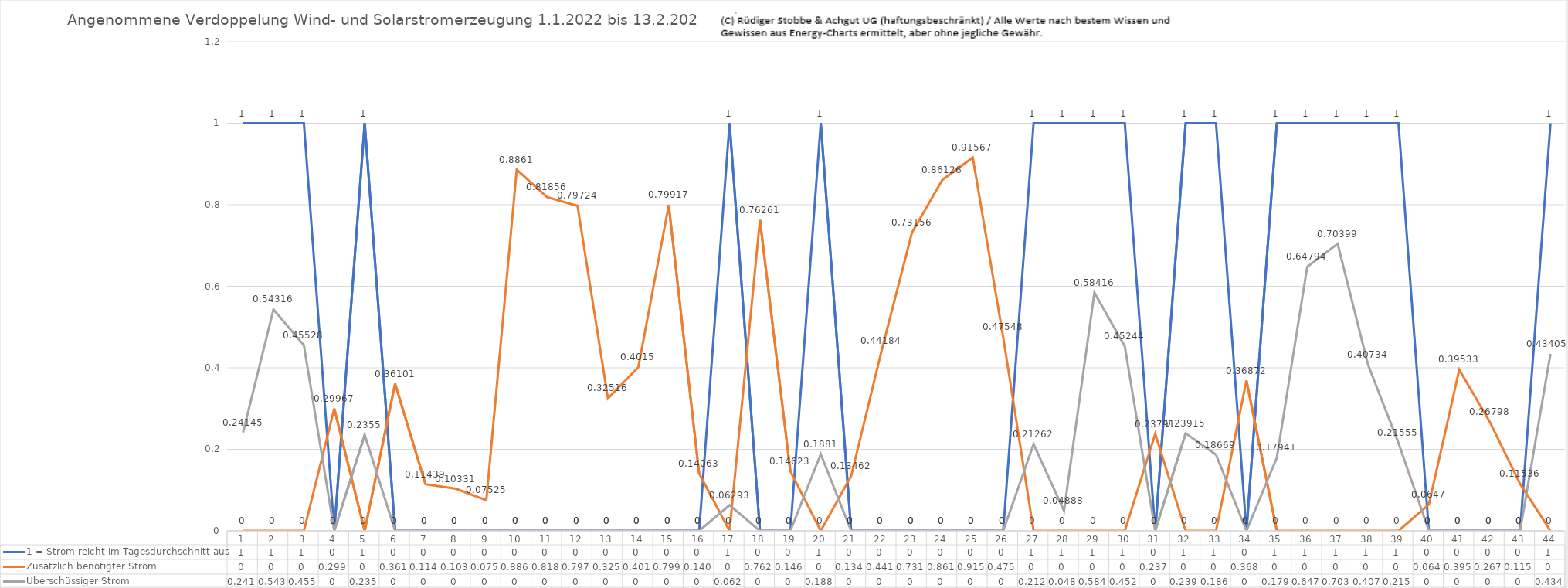
| Category | 1 = Strom reicht im Tagesdurchschnitt aus | Zusätzlich benötigter Strom | Überschüssiger Strom |
|---|---|---|---|
| 0 | 1 | 0 | 0.241 |
| 1 | 1 | 0 | 0.543 |
| 2 | 1 | 0 | 0.455 |
| 3 | 0 | 0.3 | 0 |
| 4 | 1 | 0 | 0.236 |
| 5 | 0 | 0.361 | 0 |
| 6 | 0 | 0.114 | 0 |
| 7 | 0 | 0.103 | 0 |
| 8 | 0 | 0.075 | 0 |
| 9 | 0 | 0.886 | 0 |
| 10 | 0 | 0.819 | 0 |
| 11 | 0 | 0.797 | 0 |
| 12 | 0 | 0.325 | 0 |
| 13 | 0 | 0.402 | 0 |
| 14 | 0 | 0.799 | 0 |
| 15 | 0 | 0.141 | 0 |
| 16 | 1 | 0 | 0.063 |
| 17 | 0 | 0.763 | 0 |
| 18 | 0 | 0.146 | 0 |
| 19 | 1 | 0 | 0.188 |
| 20 | 0 | 0.135 | 0 |
| 21 | 0 | 0.442 | 0 |
| 22 | 0 | 0.732 | 0 |
| 23 | 0 | 0.861 | 0 |
| 24 | 0 | 0.916 | 0 |
| 25 | 0 | 0.475 | 0 |
| 26 | 1 | 0 | 0.213 |
| 27 | 1 | 0 | 0.049 |
| 28 | 1 | 0 | 0.584 |
| 29 | 1 | 0 | 0.452 |
| 30 | 0 | 0.238 | 0 |
| 31 | 1 | 0 | 0.239 |
| 32 | 1 | 0 | 0.187 |
| 33 | 0 | 0.369 | 0 |
| 34 | 1 | 0 | 0.179 |
| 35 | 1 | 0 | 0.648 |
| 36 | 1 | 0 | 0.704 |
| 37 | 1 | 0 | 0.407 |
| 38 | 1 | 0 | 0.216 |
| 39 | 0 | 0.065 | 0 |
| 40 | 0 | 0.395 | 0 |
| 41 | 0 | 0.268 | 0 |
| 42 | 0 | 0.115 | 0 |
| 43 | 1 | 0 | 0.434 |